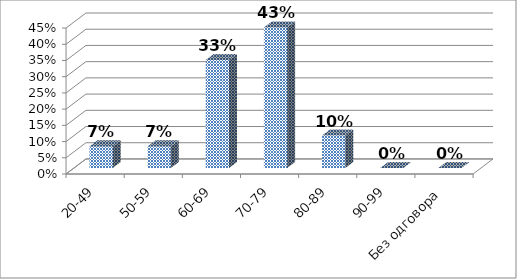
| Category | Series 0 |
|---|---|
| 20-49 | 0.067 |
| 50-59 | 0.067 |
| 60-69 | 0.333 |
| 70-79 | 0.433 |
| 80-89 | 0.1 |
| 90-99 | 0 |
| Без одговора | 0 |